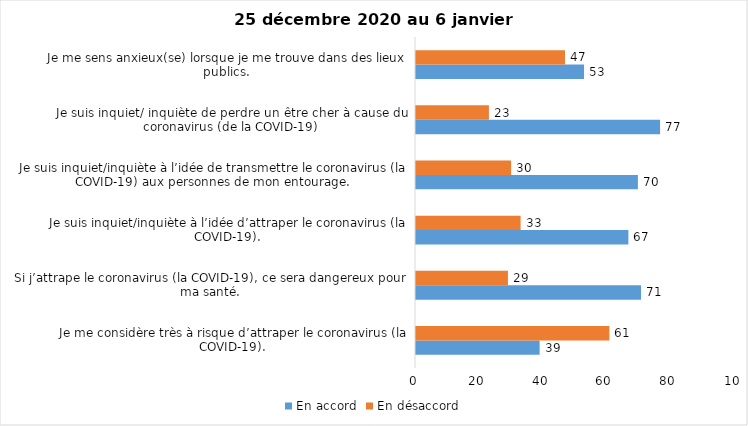
| Category | En accord | En désaccord |
|---|---|---|
| Je me considère très à risque d’attraper le coronavirus (la COVID-19). | 39 | 61 |
| Si j’attrape le coronavirus (la COVID-19), ce sera dangereux pour ma santé. | 71 | 29 |
| Je suis inquiet/inquiète à l’idée d’attraper le coronavirus (la COVID-19). | 67 | 33 |
| Je suis inquiet/inquiète à l’idée de transmettre le coronavirus (la COVID-19) aux personnes de mon entourage. | 70 | 30 |
| Je suis inquiet/ inquiète de perdre un être cher à cause du coronavirus (de la COVID-19) | 77 | 23 |
| Je me sens anxieux(se) lorsque je me trouve dans des lieux publics. | 53 | 47 |